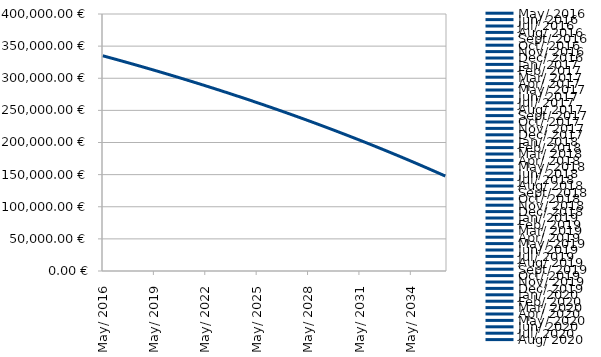
| Category | Restschuld |
|---|---|
| 2016-05-01 | 335000 |
| 2016-06-01 | 334397.917 |
| 2016-07-01 | 333794.579 |
| 2016-08-01 | 333189.984 |
| 2016-09-01 | 332584.13 |
| 2016-10-01 | 331977.014 |
| 2016-11-01 | 331368.633 |
| 2016-12-01 | 330758.984 |
| 2017-01-01 | 330148.065 |
| 2017-02-01 | 329535.874 |
| 2017-03-01 | 328922.407 |
| 2017-04-01 | 328307.662 |
| 2017-05-01 | 327691.636 |
| 2017-06-01 | 327074.327 |
| 2017-07-01 | 326455.732 |
| 2017-08-01 | 325835.848 |
| 2017-09-01 | 325214.672 |
| 2017-10-01 | 324592.203 |
| 2017-11-01 | 323968.437 |
| 2017-12-01 | 323343.371 |
| 2018-01-01 | 322717.003 |
| 2018-02-01 | 322089.33 |
| 2018-03-01 | 321460.35 |
| 2018-04-01 | 320830.059 |
| 2018-05-01 | 320198.455 |
| 2018-06-01 | 319565.535 |
| 2018-07-01 | 318931.296 |
| 2018-08-01 | 318295.736 |
| 2018-09-01 | 317658.853 |
| 2018-10-01 | 317020.642 |
| 2018-11-01 | 316381.102 |
| 2018-12-01 | 315740.229 |
| 2019-01-01 | 315098.021 |
| 2019-02-01 | 314454.475 |
| 2019-03-01 | 313809.589 |
| 2019-04-01 | 313163.359 |
| 2019-05-01 | 312515.782 |
| 2019-06-01 | 311866.857 |
| 2019-07-01 | 311216.579 |
| 2019-08-01 | 310564.947 |
| 2019-09-01 | 309911.958 |
| 2019-10-01 | 309257.608 |
| 2019-11-01 | 308601.894 |
| 2019-12-01 | 307944.815 |
| 2020-01-01 | 307286.367 |
| 2020-02-01 | 306626.546 |
| 2020-03-01 | 305965.352 |
| 2020-04-01 | 305302.78 |
| 2020-05-01 | 304638.827 |
| 2020-06-01 | 303973.491 |
| 2020-07-01 | 303306.769 |
| 2020-08-01 | 302638.658 |
| 2020-09-01 | 301969.156 |
| 2020-10-01 | 301298.258 |
| 2020-11-01 | 300625.963 |
| 2020-12-01 | 299952.267 |
| 2021-01-01 | 299277.167 |
| 2021-02-01 | 298600.662 |
| 2021-03-01 | 297922.746 |
| 2021-04-01 | 297243.419 |
| 2021-05-01 | 296562.676 |
| 2021-06-01 | 295880.515 |
| 2021-07-01 | 295196.932 |
| 2021-08-01 | 294511.926 |
| 2021-09-01 | 293825.493 |
| 2021-10-01 | 293137.629 |
| 2021-11-01 | 292448.332 |
| 2021-12-01 | 291757.6 |
| 2022-01-01 | 291065.428 |
| 2022-02-01 | 290371.814 |
| 2022-03-01 | 289676.756 |
| 2022-04-01 | 288980.249 |
| 2022-05-01 | 288282.291 |
| 2022-06-01 | 287582.879 |
| 2022-07-01 | 286882.01 |
| 2022-08-01 | 286179.681 |
| 2022-09-01 | 285475.889 |
| 2022-10-01 | 284770.63 |
| 2022-11-01 | 284063.902 |
| 2022-12-01 | 283355.702 |
| 2023-01-01 | 282646.026 |
| 2023-02-01 | 281934.872 |
| 2023-03-01 | 281222.237 |
| 2023-04-01 | 280508.116 |
| 2023-05-01 | 279792.508 |
| 2023-06-01 | 279075.409 |
| 2023-07-01 | 278356.816 |
| 2023-08-01 | 277636.726 |
| 2023-09-01 | 276915.136 |
| 2023-10-01 | 276192.043 |
| 2023-11-01 | 275467.443 |
| 2023-12-01 | 274741.333 |
| 2024-01-01 | 274013.711 |
| 2024-02-01 | 273284.573 |
| 2024-03-01 | 272553.916 |
| 2024-04-01 | 271821.737 |
| 2024-05-01 | 271088.032 |
| 2024-06-01 | 270352.799 |
| 2024-07-01 | 269616.034 |
| 2024-08-01 | 268877.734 |
| 2024-09-01 | 268137.896 |
| 2024-10-01 | 267396.516 |
| 2024-11-01 | 266653.592 |
| 2024-12-01 | 265909.121 |
| 2025-01-01 | 265163.098 |
| 2025-02-01 | 264415.521 |
| 2025-03-01 | 263666.387 |
| 2025-04-01 | 262915.692 |
| 2025-05-01 | 262163.433 |
| 2025-06-01 | 261409.607 |
| 2025-07-01 | 260654.21 |
| 2025-08-01 | 259897.24 |
| 2025-09-01 | 259138.692 |
| 2025-10-01 | 258378.564 |
| 2025-11-01 | 257616.853 |
| 2025-12-01 | 256853.555 |
| 2026-01-01 | 256088.666 |
| 2026-02-01 | 255322.184 |
| 2026-03-01 | 254554.106 |
| 2026-04-01 | 253784.427 |
| 2026-05-01 | 253013.144 |
| 2026-06-01 | 252240.255 |
| 2026-07-01 | 251465.756 |
| 2026-08-01 | 250689.643 |
| 2026-09-01 | 249911.913 |
| 2026-10-01 | 249132.562 |
| 2026-11-01 | 248351.589 |
| 2026-12-01 | 247568.988 |
| 2027-01-01 | 246784.756 |
| 2027-02-01 | 245998.891 |
| 2027-03-01 | 245211.389 |
| 2027-04-01 | 244422.246 |
| 2027-05-01 | 243631.459 |
| 2027-06-01 | 242839.025 |
| 2027-07-01 | 242044.939 |
| 2027-08-01 | 241249.2 |
| 2027-09-01 | 240451.802 |
| 2027-10-01 | 239652.743 |
| 2027-11-01 | 238852.02 |
| 2027-12-01 | 238049.628 |
| 2028-01-01 | 237245.565 |
| 2028-02-01 | 236439.827 |
| 2028-03-01 | 235632.41 |
| 2028-04-01 | 234823.31 |
| 2028-05-01 | 234012.526 |
| 2028-06-01 | 233200.052 |
| 2028-07-01 | 232385.885 |
| 2028-08-01 | 231570.022 |
| 2028-09-01 | 230752.46 |
| 2028-10-01 | 229933.194 |
| 2028-11-01 | 229112.222 |
| 2028-12-01 | 228289.539 |
| 2029-01-01 | 227465.142 |
| 2029-02-01 | 226639.028 |
| 2029-03-01 | 225811.192 |
| 2029-04-01 | 224981.632 |
| 2029-05-01 | 224150.344 |
| 2029-06-01 | 223317.324 |
| 2029-07-01 | 222482.569 |
| 2029-08-01 | 221646.074 |
| 2029-09-01 | 220807.837 |
| 2029-10-01 | 219967.853 |
| 2029-11-01 | 219126.119 |
| 2029-12-01 | 218282.632 |
| 2030-01-01 | 217437.387 |
| 2030-02-01 | 216590.382 |
| 2030-03-01 | 215741.612 |
| 2030-04-01 | 214891.074 |
| 2030-05-01 | 214038.763 |
| 2030-06-01 | 213184.677 |
| 2030-07-01 | 212328.812 |
| 2030-08-01 | 211471.164 |
| 2030-09-01 | 210611.729 |
| 2030-10-01 | 209750.503 |
| 2030-11-01 | 208887.484 |
| 2030-12-01 | 208022.666 |
| 2031-01-01 | 207156.046 |
| 2031-02-01 | 206287.621 |
| 2031-03-01 | 205417.387 |
| 2031-04-01 | 204545.34 |
| 2031-05-01 | 203671.476 |
| 2031-06-01 | 202795.792 |
| 2031-07-01 | 201918.283 |
| 2031-08-01 | 201038.946 |
| 2031-09-01 | 200157.777 |
| 2031-10-01 | 199274.773 |
| 2031-11-01 | 198389.928 |
| 2031-12-01 | 197503.241 |
| 2032-01-01 | 196614.706 |
| 2032-02-01 | 195724.32 |
| 2032-03-01 | 194832.079 |
| 2032-04-01 | 193937.979 |
| 2032-05-01 | 193042.017 |
| 2032-06-01 | 192144.187 |
| 2032-07-01 | 191244.488 |
| 2032-08-01 | 190342.914 |
| 2032-09-01 | 189439.462 |
| 2032-10-01 | 188534.127 |
| 2032-11-01 | 187626.906 |
| 2032-12-01 | 186717.796 |
| 2033-01-01 | 185806.791 |
| 2033-02-01 | 184893.889 |
| 2033-03-01 | 183979.084 |
| 2033-04-01 | 183062.374 |
| 2033-05-01 | 182143.754 |
| 2033-06-01 | 181223.22 |
| 2033-07-01 | 180300.769 |
| 2033-08-01 | 179376.395 |
| 2033-09-01 | 178450.096 |
| 2033-10-01 | 177521.867 |
| 2033-11-01 | 176591.704 |
| 2033-12-01 | 175659.604 |
| 2034-01-01 | 174725.561 |
| 2034-02-01 | 173789.573 |
| 2034-03-01 | 172851.634 |
| 2034-04-01 | 171911.742 |
| 2034-05-01 | 170969.891 |
| 2034-06-01 | 170026.079 |
| 2034-07-01 | 169080.3 |
| 2034-08-01 | 168132.55 |
| 2034-09-01 | 167182.826 |
| 2034-10-01 | 166231.124 |
| 2034-11-01 | 165277.439 |
| 2034-12-01 | 164321.767 |
| 2035-01-01 | 163364.104 |
| 2035-02-01 | 162404.446 |
| 2035-03-01 | 161442.788 |
| 2035-04-01 | 160479.127 |
| 2035-05-01 | 159513.459 |
| 2035-06-01 | 158545.779 |
| 2035-07-01 | 157576.082 |
| 2035-08-01 | 156604.366 |
| 2035-09-01 | 155630.625 |
| 2035-10-01 | 154654.855 |
| 2035-11-01 | 153677.053 |
| 2035-12-01 | 152697.214 |
| 2036-01-01 | 151715.333 |
| 2036-02-01 | 150731.406 |
| 2036-03-01 | 149745.43 |
| 2036-04-01 | 148757.4 |
| 2036-05-01 | 147767.311 |